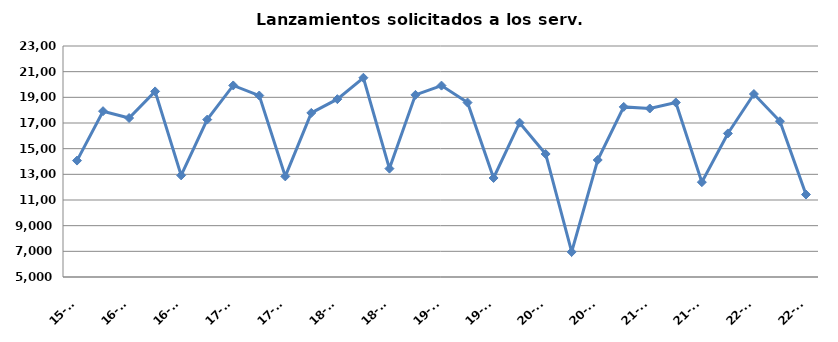
| Category | Lanzamientos solicitados a los Serv. comunes |
|---|---|
| 15-T3 | 14071 |
| 15-T4 | 17921 |
| 16-T1 | 17386 |
| 16-T2 | 19461 |
| 16-T3 | 12918 |
| 16-T4 | 17265 |
| 17-T1 | 19926 |
| 17-T2 | 19141 |
| 17-T3 | 12840 |
| 17-T4 | 17786 |
| 18-T1 | 18859 |
| 18-T2 | 20526 |
| 18-T3 | 13446 |
| 18-T4 | 19192 |
| 19-T1 | 19913 |
| 19-T2 | 18594 |
| 19-T3 | 12715 |
| 19-T4 | 17025 |
| 20-T1 | 14586 |
| 20-T2 | 6953 |
| 20-T3 | 14117 |
| 20-T4 | 18255 |
| 21-T1 | 18131 |
| 21-T2 | 18598 |
| 21-T3 | 12390 |
| 21-T4 | 16187 |
| 22-T1 | 19257 |
| 22-T2 | 17134 |
| 22-T3 | 11425 |